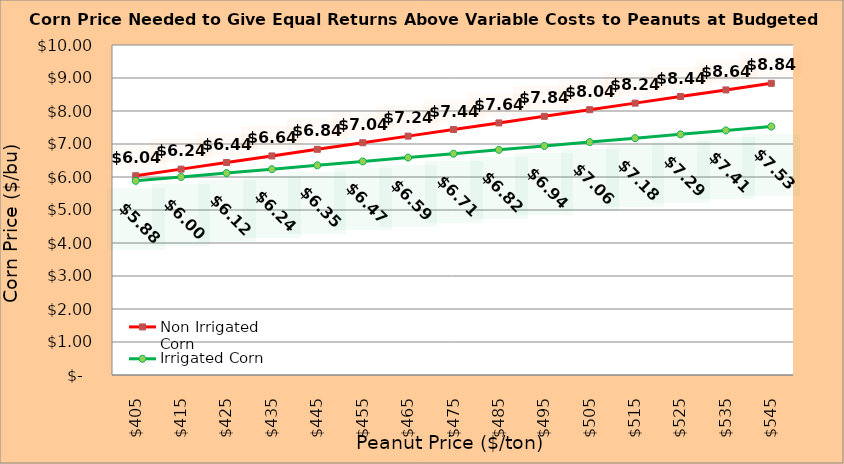
| Category | Non Irrigated Corn | Irrigated Corn |
|---|---|---|
| 405.0 | 6.039 | 5.883 |
| 415.0 | 6.239 | 6.001 |
| 425.0 | 6.439 | 6.118 |
| 435.0 | 6.639 | 6.236 |
| 445.0 | 6.839 | 6.353 |
| 455.0 | 7.039 | 6.471 |
| 465.0 | 7.239 | 6.588 |
| 475.0 | 7.439 | 6.706 |
| 485.0 | 7.639 | 6.823 |
| 495.0 | 7.839 | 6.941 |
| 505.0 | 8.039 | 7.058 |
| 515.0 | 8.239 | 7.176 |
| 525.0 | 8.439 | 7.293 |
| 535.0 | 8.639 | 7.411 |
| 545.0 | 8.839 | 7.528 |